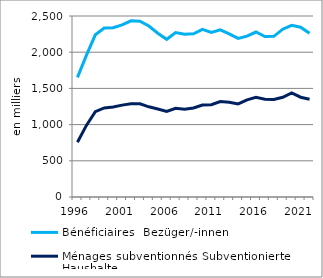
| Category | Bénéficiaires  | Ménages subventionnés |
|---|---|---|
| 1996.0 | 1651.697 | 756.457 |
| 1997.0 | 1955.994 | 988.94 |
| 1998.0 | 2240.522 | 1178.551 |
| 1999.0 | 2334.267 | 1230.09 |
| 2000.0 | 2337.717 | 1242.695 |
| 2001.0 | 2376.421 | 1268.943 |
| 2002.0 | 2433.822 | 1289.405 |
| 2003.0 | 2427.518 | 1287.365 |
| 2004.0 | 2361.377 | 1245.875 |
| 2005.0 | 2262.16 | 1215.989 |
| 2006.0 | 2178.397 | 1182.675 |
| 2007.0 | 2271.95 | 1225.436 |
| 2008.0 | 2249.481 | 1211.67 |
| 2009.0 | 2254.89 | 1229.418 |
| 2010.0 | 2315.252 | 1270.592 |
| 2011.0 | 2273.693 | 1274.39 |
| 2012.0 | 2308.013 | 1317.82 |
| 2013.0 | 2253.279 | 1307.345 |
| 2014.0 | 2191.164 | 1285.045 |
| 2015.0 | 2222.034 | 1341.923 |
| 2016.0 | 2278.684 | 1376.09 |
| 2017.0 | 2217.239 | 1350.643 |
| 2018.0 | 2219.531 | 1346.881 |
| 2019.0 | 2317.981 | 1376.651 |
| 2020.0 | 2371.507 | 1436.809 |
| 2021.0 | 2345.34 | 1378.239 |
| 2022.0 | 2260.584 | 1351.313 |